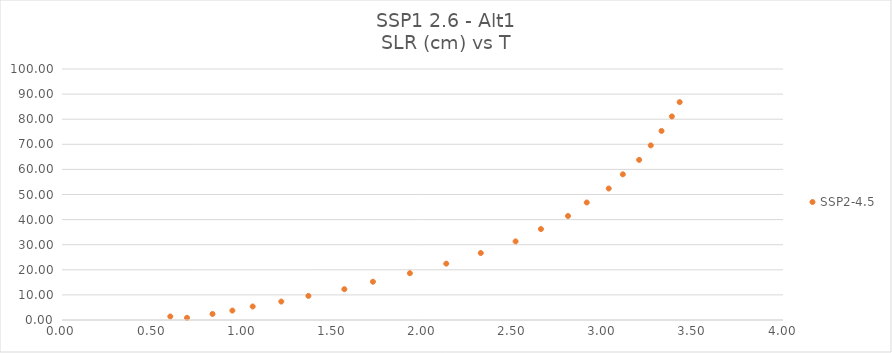
| Category | SSP2-4.5 |
|---|---|
| 0.693400617 | 0.87 |
| 0.600872844 | 1.399 |
| 0.835003234 | 2.407 |
| 0.945258389 | 3.755 |
| 1.057970477 | 5.386 |
| 1.216609042 | 7.344 |
| 1.366998793 | 9.606 |
| 1.566434093 | 12.264 |
| 1.725137117 | 15.242 |
| 1.930069364 | 18.639 |
| 2.131910838 | 22.459 |
| 2.323506779 | 26.684 |
| 2.516505038 | 31.32 |
| 2.657159805 | 36.233 |
| 2.807257579 | 41.441 |
| 2.911235411 | 46.813 |
| 3.033186146 | 52.388 |
| 3.111415519 | 58.038 |
| 3.201862444 | 63.788 |
| 3.266298087 | 69.558 |
| 3.326103087 | 75.33 |
| 3.383456807 | 81.093 |
| 3.426742442 | 86.804 |